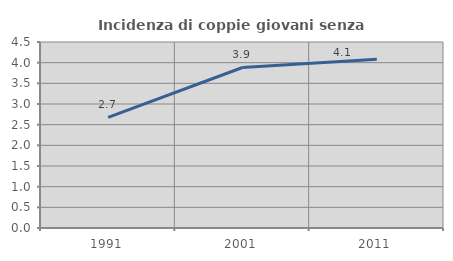
| Category | Incidenza di coppie giovani senza figli |
|---|---|
| 1991.0 | 2.679 |
| 2001.0 | 3.883 |
| 2011.0 | 4.082 |